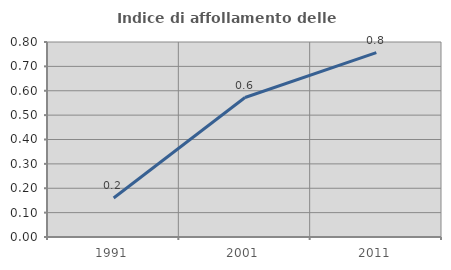
| Category | Indice di affollamento delle abitazioni  |
|---|---|
| 1991.0 | 0.16 |
| 2001.0 | 0.572 |
| 2011.0 | 0.757 |